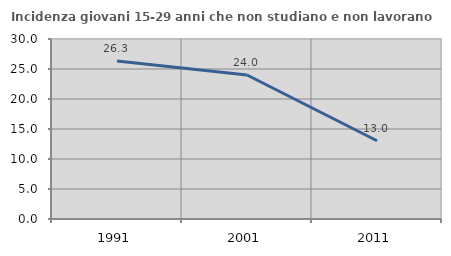
| Category | Incidenza giovani 15-29 anni che non studiano e non lavorano  |
|---|---|
| 1991.0 | 26.344 |
| 2001.0 | 24 |
| 2011.0 | 13.043 |